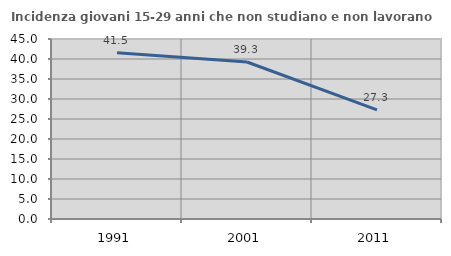
| Category | Incidenza giovani 15-29 anni che non studiano e non lavorano  |
|---|---|
| 1991.0 | 41.536 |
| 2001.0 | 39.257 |
| 2011.0 | 27.273 |